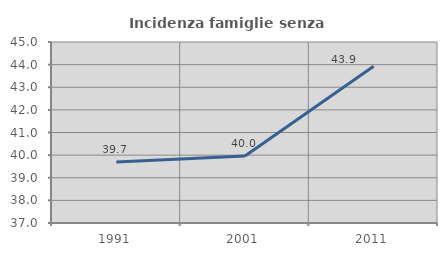
| Category | Incidenza famiglie senza nuclei |
|---|---|
| 1991.0 | 39.698 |
| 2001.0 | 39.965 |
| 2011.0 | 43.932 |